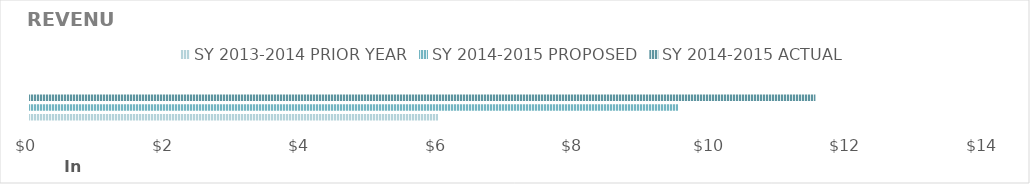
| Category | SY 2013-2014 | SY 2014-2015 |
|---|---|---|
| 0 | 5982 | 11513.87 |